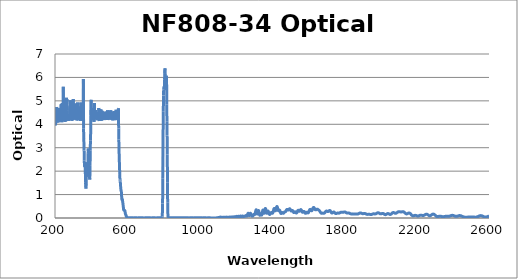
| Category | Optical Density |
|---|---|
| 2600.0 | 0.08 |
| 2599.0 | 0.078 |
| 2598.0 | 0.077 |
| 2597.0 | 0.075 |
| 2596.0 | 0.072 |
| 2595.0 | 0.069 |
| 2594.0 | 0.066 |
| 2593.0 | 0.063 |
| 2592.0 | 0.06 |
| 2591.0 | 0.057 |
| 2590.0 | 0.054 |
| 2589.0 | 0.051 |
| 2588.0 | 0.049 |
| 2587.0 | 0.046 |
| 2586.0 | 0.044 |
| 2585.0 | 0.043 |
| 2584.0 | 0.041 |
| 2583.0 | 0.04 |
| 2582.0 | 0.039 |
| 2581.0 | 0.039 |
| 2580.0 | 0.039 |
| 2579.0 | 0.039 |
| 2578.0 | 0.04 |
| 2577.0 | 0.041 |
| 2576.0 | 0.042 |
| 2575.0 | 0.044 |
| 2574.0 | 0.046 |
| 2573.0 | 0.049 |
| 2572.0 | 0.052 |
| 2571.0 | 0.055 |
| 2570.0 | 0.059 |
| 2569.0 | 0.063 |
| 2568.0 | 0.067 |
| 2567.0 | 0.072 |
| 2566.0 | 0.076 |
| 2565.0 | 0.08 |
| 2564.0 | 0.084 |
| 2563.0 | 0.087 |
| 2562.0 | 0.091 |
| 2561.0 | 0.093 |
| 2560.0 | 0.096 |
| 2559.0 | 0.098 |
| 2558.0 | 0.099 |
| 2557.0 | 0.101 |
| 2556.0 | 0.101 |
| 2555.0 | 0.102 |
| 2554.0 | 0.102 |
| 2553.0 | 0.102 |
| 2552.0 | 0.101 |
| 2551.0 | 0.1 |
| 2550.0 | 0.098 |
| 2549.0 | 0.095 |
| 2548.0 | 0.093 |
| 2547.0 | 0.09 |
| 2546.0 | 0.086 |
| 2545.0 | 0.083 |
| 2544.0 | 0.08 |
| 2543.0 | 0.076 |
| 2542.0 | 0.073 |
| 2541.0 | 0.069 |
| 2540.0 | 0.066 |
| 2539.0 | 0.063 |
| 2538.0 | 0.059 |
| 2537.0 | 0.056 |
| 2536.0 | 0.052 |
| 2535.0 | 0.049 |
| 2534.0 | 0.046 |
| 2533.0 | 0.044 |
| 2532.0 | 0.042 |
| 2531.0 | 0.039 |
| 2530.0 | 0.038 |
| 2529.0 | 0.037 |
| 2528.0 | 0.036 |
| 2527.0 | 0.035 |
| 2526.0 | 0.035 |
| 2525.0 | 0.035 |
| 2524.0 | 0.035 |
| 2523.0 | 0.035 |
| 2522.0 | 0.036 |
| 2521.0 | 0.037 |
| 2520.0 | 0.038 |
| 2519.0 | 0.039 |
| 2518.0 | 0.04 |
| 2517.0 | 0.041 |
| 2516.0 | 0.042 |
| 2515.0 | 0.043 |
| 2514.0 | 0.044 |
| 2513.0 | 0.045 |
| 2512.0 | 0.046 |
| 2511.0 | 0.046 |
| 2510.0 | 0.046 |
| 2509.0 | 0.047 |
| 2508.0 | 0.047 |
| 2507.0 | 0.047 |
| 2506.0 | 0.047 |
| 2505.0 | 0.046 |
| 2504.0 | 0.046 |
| 2503.0 | 0.045 |
| 2502.0 | 0.045 |
| 2501.0 | 0.044 |
| 2500.0 | 0.044 |
| 2499.0 | 0.043 |
| 2498.0 | 0.042 |
| 2497.0 | 0.041 |
| 2496.0 | 0.041 |
| 2495.0 | 0.04 |
| 2494.0 | 0.04 |
| 2493.0 | 0.039 |
| 2492.0 | 0.039 |
| 2491.0 | 0.039 |
| 2490.0 | 0.038 |
| 2489.0 | 0.038 |
| 2488.0 | 0.038 |
| 2487.0 | 0.038 |
| 2486.0 | 0.038 |
| 2485.0 | 0.038 |
| 2484.0 | 0.038 |
| 2483.0 | 0.037 |
| 2482.0 | 0.037 |
| 2481.0 | 0.037 |
| 2480.0 | 0.037 |
| 2479.0 | 0.037 |
| 2478.0 | 0.037 |
| 2477.0 | 0.037 |
| 2476.0 | 0.037 |
| 2475.0 | 0.037 |
| 2474.0 | 0.036 |
| 2473.0 | 0.036 |
| 2472.0 | 0.036 |
| 2471.0 | 0.036 |
| 2470.0 | 0.036 |
| 2469.0 | 0.036 |
| 2468.0 | 0.036 |
| 2467.0 | 0.037 |
| 2466.0 | 0.037 |
| 2465.0 | 0.038 |
| 2464.0 | 0.039 |
| 2463.0 | 0.04 |
| 2462.0 | 0.042 |
| 2461.0 | 0.044 |
| 2460.0 | 0.046 |
| 2459.0 | 0.048 |
| 2458.0 | 0.051 |
| 2457.0 | 0.053 |
| 2456.0 | 0.056 |
| 2455.0 | 0.06 |
| 2454.0 | 0.063 |
| 2453.0 | 0.067 |
| 2452.0 | 0.07 |
| 2451.0 | 0.074 |
| 2450.0 | 0.077 |
| 2449.0 | 0.081 |
| 2448.0 | 0.084 |
| 2447.0 | 0.087 |
| 2446.0 | 0.09 |
| 2445.0 | 0.093 |
| 2444.0 | 0.096 |
| 2443.0 | 0.098 |
| 2442.0 | 0.1 |
| 2441.0 | 0.101 |
| 2440.0 | 0.102 |
| 2439.0 | 0.103 |
| 2438.0 | 0.103 |
| 2437.0 | 0.103 |
| 2436.0 | 0.102 |
| 2435.0 | 0.101 |
| 2434.0 | 0.1 |
| 2433.0 | 0.098 |
| 2432.0 | 0.096 |
| 2431.0 | 0.094 |
| 2430.0 | 0.091 |
| 2429.0 | 0.089 |
| 2428.0 | 0.086 |
| 2427.0 | 0.083 |
| 2426.0 | 0.081 |
| 2425.0 | 0.078 |
| 2424.0 | 0.076 |
| 2423.0 | 0.074 |
| 2422.0 | 0.073 |
| 2421.0 | 0.072 |
| 2420.0 | 0.071 |
| 2419.0 | 0.071 |
| 2418.0 | 0.071 |
| 2417.0 | 0.071 |
| 2416.0 | 0.072 |
| 2415.0 | 0.073 |
| 2414.0 | 0.075 |
| 2413.0 | 0.077 |
| 2412.0 | 0.08 |
| 2411.0 | 0.083 |
| 2410.0 | 0.086 |
| 2409.0 | 0.088 |
| 2408.0 | 0.092 |
| 2407.0 | 0.095 |
| 2406.0 | 0.098 |
| 2405.0 | 0.101 |
| 2404.0 | 0.103 |
| 2403.0 | 0.106 |
| 2402.0 | 0.108 |
| 2401.0 | 0.11 |
| 2400.0 | 0.111 |
| 2399.0 | 0.112 |
| 2398.0 | 0.113 |
| 2397.0 | 0.113 |
| 2396.0 | 0.113 |
| 2395.0 | 0.112 |
| 2394.0 | 0.111 |
| 2393.0 | 0.109 |
| 2392.0 | 0.108 |
| 2391.0 | 0.105 |
| 2390.0 | 0.103 |
| 2389.0 | 0.1 |
| 2388.0 | 0.097 |
| 2387.0 | 0.094 |
| 2386.0 | 0.091 |
| 2385.0 | 0.089 |
| 2384.0 | 0.086 |
| 2383.0 | 0.083 |
| 2382.0 | 0.081 |
| 2381.0 | 0.079 |
| 2380.0 | 0.077 |
| 2379.0 | 0.076 |
| 2378.0 | 0.075 |
| 2377.0 | 0.074 |
| 2376.0 | 0.073 |
| 2375.0 | 0.073 |
| 2374.0 | 0.073 |
| 2373.0 | 0.073 |
| 2372.0 | 0.073 |
| 2371.0 | 0.073 |
| 2370.0 | 0.074 |
| 2369.0 | 0.074 |
| 2368.0 | 0.075 |
| 2367.0 | 0.075 |
| 2366.0 | 0.075 |
| 2365.0 | 0.075 |
| 2364.0 | 0.075 |
| 2363.0 | 0.075 |
| 2362.0 | 0.074 |
| 2361.0 | 0.074 |
| 2360.0 | 0.073 |
| 2359.0 | 0.071 |
| 2358.0 | 0.07 |
| 2357.0 | 0.068 |
| 2356.0 | 0.067 |
| 2355.0 | 0.065 |
| 2354.0 | 0.063 |
| 2353.0 | 0.061 |
| 2352.0 | 0.06 |
| 2351.0 | 0.058 |
| 2350.0 | 0.057 |
| 2349.0 | 0.056 |
| 2348.0 | 0.055 |
| 2347.0 | 0.055 |
| 2346.0 | 0.054 |
| 2345.0 | 0.055 |
| 2344.0 | 0.055 |
| 2343.0 | 0.056 |
| 2342.0 | 0.058 |
| 2341.0 | 0.059 |
| 2340.0 | 0.061 |
| 2339.0 | 0.063 |
| 2338.0 | 0.065 |
| 2337.0 | 0.067 |
| 2336.0 | 0.069 |
| 2335.0 | 0.071 |
| 2334.0 | 0.073 |
| 2333.0 | 0.075 |
| 2332.0 | 0.076 |
| 2331.0 | 0.077 |
| 2330.0 | 0.078 |
| 2329.0 | 0.078 |
| 2328.0 | 0.078 |
| 2327.0 | 0.078 |
| 2326.0 | 0.077 |
| 2325.0 | 0.076 |
| 2324.0 | 0.074 |
| 2323.0 | 0.073 |
| 2322.0 | 0.071 |
| 2321.0 | 0.069 |
| 2320.0 | 0.067 |
| 2319.0 | 0.065 |
| 2318.0 | 0.064 |
| 2317.0 | 0.062 |
| 2316.0 | 0.062 |
| 2315.0 | 0.061 |
| 2314.0 | 0.062 |
| 2313.0 | 0.063 |
| 2312.0 | 0.065 |
| 2311.0 | 0.068 |
| 2310.0 | 0.071 |
| 2309.0 | 0.075 |
| 2308.0 | 0.08 |
| 2307.0 | 0.086 |
| 2306.0 | 0.092 |
| 2305.0 | 0.098 |
| 2304.0 | 0.105 |
| 2303.0 | 0.113 |
| 2302.0 | 0.12 |
| 2301.0 | 0.127 |
| 2300.0 | 0.133 |
| 2299.0 | 0.14 |
| 2298.0 | 0.146 |
| 2297.0 | 0.151 |
| 2296.0 | 0.156 |
| 2295.0 | 0.16 |
| 2294.0 | 0.162 |
| 2293.0 | 0.165 |
| 2292.0 | 0.166 |
| 2291.0 | 0.166 |
| 2290.0 | 0.166 |
| 2289.0 | 0.164 |
| 2288.0 | 0.162 |
| 2287.0 | 0.159 |
| 2286.0 | 0.155 |
| 2285.0 | 0.15 |
| 2284.0 | 0.145 |
| 2283.0 | 0.139 |
| 2282.0 | 0.134 |
| 2281.0 | 0.128 |
| 2280.0 | 0.122 |
| 2279.0 | 0.116 |
| 2278.0 | 0.111 |
| 2277.0 | 0.106 |
| 2276.0 | 0.102 |
| 2275.0 | 0.099 |
| 2274.0 | 0.097 |
| 2273.0 | 0.096 |
| 2272.0 | 0.096 |
| 2271.0 | 0.097 |
| 2270.0 | 0.099 |
| 2269.0 | 0.102 |
| 2268.0 | 0.106 |
| 2267.0 | 0.111 |
| 2266.0 | 0.116 |
| 2265.0 | 0.121 |
| 2264.0 | 0.126 |
| 2263.0 | 0.132 |
| 2262.0 | 0.137 |
| 2261.0 | 0.142 |
| 2260.0 | 0.147 |
| 2259.0 | 0.151 |
| 2258.0 | 0.155 |
| 2257.0 | 0.157 |
| 2256.0 | 0.159 |
| 2255.0 | 0.16 |
| 2254.0 | 0.161 |
| 2253.0 | 0.16 |
| 2252.0 | 0.159 |
| 2251.0 | 0.157 |
| 2250.0 | 0.154 |
| 2249.0 | 0.151 |
| 2248.0 | 0.147 |
| 2247.0 | 0.142 |
| 2246.0 | 0.138 |
| 2245.0 | 0.134 |
| 2244.0 | 0.129 |
| 2243.0 | 0.125 |
| 2242.0 | 0.12 |
| 2241.0 | 0.116 |
| 2240.0 | 0.113 |
| 2239.0 | 0.11 |
| 2238.0 | 0.108 |
| 2237.0 | 0.106 |
| 2236.0 | 0.106 |
| 2235.0 | 0.105 |
| 2234.0 | 0.106 |
| 2233.0 | 0.107 |
| 2232.0 | 0.108 |
| 2231.0 | 0.11 |
| 2230.0 | 0.112 |
| 2229.0 | 0.114 |
| 2228.0 | 0.116 |
| 2227.0 | 0.117 |
| 2226.0 | 0.119 |
| 2225.0 | 0.12 |
| 2224.0 | 0.12 |
| 2223.0 | 0.121 |
| 2222.0 | 0.12 |
| 2221.0 | 0.119 |
| 2220.0 | 0.118 |
| 2219.0 | 0.115 |
| 2218.0 | 0.113 |
| 2217.0 | 0.111 |
| 2216.0 | 0.107 |
| 2215.0 | 0.105 |
| 2214.0 | 0.102 |
| 2213.0 | 0.098 |
| 2212.0 | 0.096 |
| 2211.0 | 0.093 |
| 2210.0 | 0.09 |
| 2209.0 | 0.089 |
| 2208.0 | 0.087 |
| 2207.0 | 0.087 |
| 2206.0 | 0.087 |
| 2205.0 | 0.087 |
| 2204.0 | 0.088 |
| 2203.0 | 0.09 |
| 2202.0 | 0.092 |
| 2201.0 | 0.094 |
| 2200.0 | 0.097 |
| 2199.0 | 0.1 |
| 2198.0 | 0.103 |
| 2197.0 | 0.105 |
| 2196.0 | 0.108 |
| 2195.0 | 0.11 |
| 2194.0 | 0.111 |
| 2193.0 | 0.112 |
| 2192.0 | 0.113 |
| 2191.0 | 0.113 |
| 2190.0 | 0.112 |
| 2189.0 | 0.111 |
| 2188.0 | 0.109 |
| 2187.0 | 0.107 |
| 2186.0 | 0.104 |
| 2185.0 | 0.102 |
| 2184.0 | 0.099 |
| 2183.0 | 0.097 |
| 2182.0 | 0.095 |
| 2181.0 | 0.095 |
| 2180.0 | 0.094 |
| 2179.0 | 0.095 |
| 2178.0 | 0.097 |
| 2177.0 | 0.099 |
| 2176.0 | 0.103 |
| 2175.0 | 0.108 |
| 2174.0 | 0.113 |
| 2173.0 | 0.12 |
| 2172.0 | 0.127 |
| 2171.0 | 0.135 |
| 2170.0 | 0.144 |
| 2169.0 | 0.152 |
| 2168.0 | 0.161 |
| 2167.0 | 0.169 |
| 2166.0 | 0.177 |
| 2165.0 | 0.185 |
| 2164.0 | 0.192 |
| 2163.0 | 0.198 |
| 2162.0 | 0.203 |
| 2161.0 | 0.207 |
| 2160.0 | 0.21 |
| 2159.0 | 0.212 |
| 2158.0 | 0.213 |
| 2157.0 | 0.212 |
| 2156.0 | 0.211 |
| 2155.0 | 0.209 |
| 2154.0 | 0.206 |
| 2153.0 | 0.202 |
| 2152.0 | 0.198 |
| 2151.0 | 0.193 |
| 2150.0 | 0.189 |
| 2149.0 | 0.185 |
| 2148.0 | 0.181 |
| 2147.0 | 0.178 |
| 2146.0 | 0.176 |
| 2145.0 | 0.175 |
| 2144.0 | 0.175 |
| 2143.0 | 0.177 |
| 2142.0 | 0.179 |
| 2141.0 | 0.183 |
| 2140.0 | 0.187 |
| 2139.0 | 0.193 |
| 2138.0 | 0.199 |
| 2137.0 | 0.206 |
| 2136.0 | 0.213 |
| 2135.0 | 0.22 |
| 2134.0 | 0.228 |
| 2133.0 | 0.234 |
| 2132.0 | 0.241 |
| 2131.0 | 0.247 |
| 2130.0 | 0.252 |
| 2129.0 | 0.257 |
| 2128.0 | 0.261 |
| 2127.0 | 0.264 |
| 2126.0 | 0.266 |
| 2125.0 | 0.268 |
| 2124.0 | 0.268 |
| 2123.0 | 0.269 |
| 2122.0 | 0.268 |
| 2121.0 | 0.267 |
| 2120.0 | 0.266 |
| 2119.0 | 0.265 |
| 2118.0 | 0.263 |
| 2117.0 | 0.262 |
| 2116.0 | 0.261 |
| 2115.0 | 0.26 |
| 2114.0 | 0.259 |
| 2113.0 | 0.259 |
| 2112.0 | 0.259 |
| 2111.0 | 0.26 |
| 2110.0 | 0.262 |
| 2109.0 | 0.263 |
| 2108.0 | 0.265 |
| 2107.0 | 0.267 |
| 2106.0 | 0.268 |
| 2105.0 | 0.27 |
| 2104.0 | 0.271 |
| 2103.0 | 0.272 |
| 2102.0 | 0.272 |
| 2101.0 | 0.271 |
| 2100.0 | 0.27 |
| 2099.0 | 0.267 |
| 2098.0 | 0.264 |
| 2097.0 | 0.261 |
| 2096.0 | 0.256 |
| 2095.0 | 0.252 |
| 2094.0 | 0.246 |
| 2093.0 | 0.241 |
| 2092.0 | 0.235 |
| 2091.0 | 0.228 |
| 2090.0 | 0.223 |
| 2089.0 | 0.217 |
| 2088.0 | 0.212 |
| 2087.0 | 0.208 |
| 2086.0 | 0.205 |
| 2085.0 | 0.202 |
| 2084.0 | 0.201 |
| 2083.0 | 0.201 |
| 2082.0 | 0.202 |
| 2081.0 | 0.203 |
| 2080.0 | 0.206 |
| 2079.0 | 0.209 |
| 2078.0 | 0.213 |
| 2077.0 | 0.217 |
| 2076.0 | 0.221 |
| 2075.0 | 0.224 |
| 2074.0 | 0.227 |
| 2073.0 | 0.23 |
| 2072.0 | 0.232 |
| 2071.0 | 0.232 |
| 2070.0 | 0.232 |
| 2069.0 | 0.23 |
| 2068.0 | 0.227 |
| 2067.0 | 0.223 |
| 2066.0 | 0.218 |
| 2065.0 | 0.212 |
| 2064.0 | 0.205 |
| 2063.0 | 0.198 |
| 2062.0 | 0.191 |
| 2061.0 | 0.184 |
| 2060.0 | 0.176 |
| 2059.0 | 0.17 |
| 2058.0 | 0.164 |
| 2057.0 | 0.159 |
| 2056.0 | 0.155 |
| 2055.0 | 0.153 |
| 2054.0 | 0.152 |
| 2053.0 | 0.152 |
| 2052.0 | 0.153 |
| 2051.0 | 0.156 |
| 2050.0 | 0.159 |
| 2049.0 | 0.163 |
| 2048.0 | 0.167 |
| 2047.0 | 0.171 |
| 2046.0 | 0.176 |
| 2045.0 | 0.18 |
| 2044.0 | 0.183 |
| 2043.0 | 0.186 |
| 2042.0 | 0.188 |
| 2041.0 | 0.189 |
| 2040.0 | 0.188 |
| 2039.0 | 0.187 |
| 2038.0 | 0.185 |
| 2037.0 | 0.181 |
| 2036.0 | 0.177 |
| 2035.0 | 0.172 |
| 2034.0 | 0.167 |
| 2033.0 | 0.162 |
| 2032.0 | 0.157 |
| 2031.0 | 0.152 |
| 2030.0 | 0.148 |
| 2029.0 | 0.145 |
| 2028.0 | 0.143 |
| 2027.0 | 0.143 |
| 2026.0 | 0.143 |
| 2025.0 | 0.145 |
| 2024.0 | 0.148 |
| 2023.0 | 0.152 |
| 2022.0 | 0.157 |
| 2021.0 | 0.162 |
| 2020.0 | 0.167 |
| 2019.0 | 0.172 |
| 2018.0 | 0.178 |
| 2017.0 | 0.183 |
| 2016.0 | 0.186 |
| 2015.0 | 0.19 |
| 2014.0 | 0.192 |
| 2013.0 | 0.194 |
| 2012.0 | 0.194 |
| 2011.0 | 0.194 |
| 2010.0 | 0.193 |
| 2009.0 | 0.192 |
| 2008.0 | 0.19 |
| 2007.0 | 0.187 |
| 2006.0 | 0.185 |
| 2005.0 | 0.182 |
| 2004.0 | 0.18 |
| 2003.0 | 0.178 |
| 2002.0 | 0.177 |
| 2001.0 | 0.176 |
| 2000.0 | 0.177 |
| 1999.0 | 0.179 |
| 1998.0 | 0.181 |
| 1997.0 | 0.185 |
| 1996.0 | 0.189 |
| 1995.0 | 0.193 |
| 1994.0 | 0.198 |
| 1993.0 | 0.204 |
| 1992.0 | 0.209 |
| 1991.0 | 0.213 |
| 1990.0 | 0.217 |
| 1989.0 | 0.22 |
| 1988.0 | 0.222 |
| 1987.0 | 0.224 |
| 1986.0 | 0.224 |
| 1985.0 | 0.223 |
| 1984.0 | 0.221 |
| 1983.0 | 0.218 |
| 1982.0 | 0.215 |
| 1981.0 | 0.211 |
| 1980.0 | 0.206 |
| 1979.0 | 0.201 |
| 1978.0 | 0.196 |
| 1977.0 | 0.191 |
| 1976.0 | 0.187 |
| 1975.0 | 0.183 |
| 1974.0 | 0.18 |
| 1973.0 | 0.177 |
| 1972.0 | 0.175 |
| 1971.0 | 0.174 |
| 1970.0 | 0.174 |
| 1969.0 | 0.174 |
| 1968.0 | 0.174 |
| 1967.0 | 0.175 |
| 1966.0 | 0.176 |
| 1965.0 | 0.177 |
| 1964.0 | 0.178 |
| 1963.0 | 0.178 |
| 1962.0 | 0.178 |
| 1961.0 | 0.178 |
| 1960.0 | 0.177 |
| 1959.0 | 0.175 |
| 1958.0 | 0.173 |
| 1957.0 | 0.17 |
| 1956.0 | 0.167 |
| 1955.0 | 0.164 |
| 1954.0 | 0.161 |
| 1953.0 | 0.158 |
| 1952.0 | 0.155 |
| 1951.0 | 0.152 |
| 1950.0 | 0.15 |
| 1949.0 | 0.149 |
| 1948.0 | 0.148 |
| 1947.0 | 0.148 |
| 1946.0 | 0.148 |
| 1945.0 | 0.149 |
| 1944.0 | 0.151 |
| 1943.0 | 0.152 |
| 1942.0 | 0.154 |
| 1941.0 | 0.155 |
| 1940.0 | 0.157 |
| 1939.0 | 0.158 |
| 1938.0 | 0.159 |
| 1937.0 | 0.16 |
| 1936.0 | 0.16 |
| 1935.0 | 0.159 |
| 1934.0 | 0.158 |
| 1933.0 | 0.158 |
| 1932.0 | 0.157 |
| 1931.0 | 0.155 |
| 1930.0 | 0.155 |
| 1929.0 | 0.154 |
| 1928.0 | 0.154 |
| 1927.0 | 0.154 |
| 1926.0 | 0.155 |
| 1925.0 | 0.157 |
| 1924.0 | 0.159 |
| 1923.0 | 0.161 |
| 1922.0 | 0.165 |
| 1921.0 | 0.169 |
| 1920.0 | 0.173 |
| 1919.0 | 0.178 |
| 1918.0 | 0.182 |
| 1917.0 | 0.184 |
| 1916.0 | 0.187 |
| 1915.0 | 0.189 |
| 1914.0 | 0.191 |
| 1913.0 | 0.193 |
| 1912.0 | 0.194 |
| 1911.0 | 0.194 |
| 1910.0 | 0.193 |
| 1909.0 | 0.191 |
| 1908.0 | 0.19 |
| 1907.0 | 0.188 |
| 1906.0 | 0.187 |
| 1905.0 | 0.186 |
| 1904.0 | 0.185 |
| 1903.0 | 0.185 |
| 1902.0 | 0.184 |
| 1901.0 | 0.185 |
| 1900.0 | 0.187 |
| 1899.0 | 0.19 |
| 1898.0 | 0.193 |
| 1897.0 | 0.196 |
| 1896.0 | 0.199 |
| 1895.0 | 0.202 |
| 1894.0 | 0.205 |
| 1893.0 | 0.208 |
| 1892.0 | 0.212 |
| 1891.0 | 0.215 |
| 1890.0 | 0.217 |
| 1889.0 | 0.218 |
| 1888.0 | 0.217 |
| 1887.0 | 0.216 |
| 1886.0 | 0.214 |
| 1885.0 | 0.211 |
| 1884.0 | 0.208 |
| 1883.0 | 0.204 |
| 1882.0 | 0.2 |
| 1881.0 | 0.195 |
| 1880.0 | 0.19 |
| 1879.0 | 0.185 |
| 1878.0 | 0.181 |
| 1877.0 | 0.177 |
| 1876.0 | 0.174 |
| 1875.0 | 0.171 |
| 1874.0 | 0.169 |
| 1873.0 | 0.168 |
| 1872.0 | 0.167 |
| 1871.0 | 0.166 |
| 1870.0 | 0.166 |
| 1869.0 | 0.166 |
| 1868.0 | 0.166 |
| 1867.0 | 0.167 |
| 1866.0 | 0.166 |
| 1865.0 | 0.166 |
| 1864.0 | 0.166 |
| 1863.0 | 0.166 |
| 1862.0 | 0.165 |
| 1861.0 | 0.166 |
| 1860.0 | 0.166 |
| 1859.0 | 0.167 |
| 1858.0 | 0.167 |
| 1857.0 | 0.167 |
| 1856.0 | 0.168 |
| 1855.0 | 0.168 |
| 1854.0 | 0.169 |
| 1853.0 | 0.171 |
| 1852.0 | 0.172 |
| 1851.0 | 0.173 |
| 1850.0 | 0.173 |
| 1849.0 | 0.174 |
| 1848.0 | 0.174 |
| 1847.0 | 0.176 |
| 1846.0 | 0.176 |
| 1845.0 | 0.176 |
| 1844.0 | 0.175 |
| 1843.0 | 0.173 |
| 1842.0 | 0.172 |
| 1841.0 | 0.172 |
| 1840.0 | 0.173 |
| 1839.0 | 0.173 |
| 1838.0 | 0.173 |
| 1837.0 | 0.175 |
| 1836.0 | 0.177 |
| 1835.0 | 0.179 |
| 1834.0 | 0.182 |
| 1833.0 | 0.185 |
| 1832.0 | 0.188 |
| 1831.0 | 0.193 |
| 1830.0 | 0.198 |
| 1829.0 | 0.202 |
| 1828.0 | 0.205 |
| 1827.0 | 0.209 |
| 1826.0 | 0.211 |
| 1825.0 | 0.213 |
| 1824.0 | 0.214 |
| 1823.0 | 0.213 |
| 1822.0 | 0.213 |
| 1821.0 | 0.213 |
| 1820.0 | 0.213 |
| 1819.0 | 0.212 |
| 1818.0 | 0.212 |
| 1817.0 | 0.211 |
| 1816.0 | 0.211 |
| 1815.0 | 0.212 |
| 1814.0 | 0.214 |
| 1813.0 | 0.216 |
| 1812.0 | 0.22 |
| 1811.0 | 0.225 |
| 1810.0 | 0.23 |
| 1809.0 | 0.234 |
| 1808.0 | 0.239 |
| 1807.0 | 0.244 |
| 1806.0 | 0.249 |
| 1805.0 | 0.253 |
| 1804.0 | 0.256 |
| 1803.0 | 0.259 |
| 1802.0 | 0.26 |
| 1801.0 | 0.26 |
| 1800.0 | 0.259 |
| 1799.0 | 0.257 |
| 1798.0 | 0.255 |
| 1797.0 | 0.252 |
| 1796.0 | 0.249 |
| 1795.0 | 0.246 |
| 1794.0 | 0.244 |
| 1793.0 | 0.242 |
| 1792.0 | 0.241 |
| 1791.0 | 0.241 |
| 1790.0 | 0.241 |
| 1789.0 | 0.242 |
| 1788.0 | 0.244 |
| 1787.0 | 0.245 |
| 1786.0 | 0.247 |
| 1785.0 | 0.248 |
| 1784.0 | 0.249 |
| 1783.0 | 0.249 |
| 1782.0 | 0.248 |
| 1781.0 | 0.246 |
| 1780.0 | 0.243 |
| 1779.0 | 0.239 |
| 1778.0 | 0.235 |
| 1777.0 | 0.23 |
| 1776.0 | 0.225 |
| 1775.0 | 0.22 |
| 1774.0 | 0.216 |
| 1773.0 | 0.212 |
| 1772.0 | 0.209 |
| 1771.0 | 0.208 |
| 1770.0 | 0.207 |
| 1769.0 | 0.207 |
| 1768.0 | 0.208 |
| 1767.0 | 0.209 |
| 1766.0 | 0.211 |
| 1765.0 | 0.212 |
| 1764.0 | 0.213 |
| 1763.0 | 0.213 |
| 1762.0 | 0.212 |
| 1761.0 | 0.21 |
| 1760.0 | 0.207 |
| 1759.0 | 0.203 |
| 1758.0 | 0.199 |
| 1757.0 | 0.195 |
| 1756.0 | 0.191 |
| 1755.0 | 0.188 |
| 1754.0 | 0.187 |
| 1753.0 | 0.187 |
| 1752.0 | 0.189 |
| 1751.0 | 0.193 |
| 1750.0 | 0.199 |
| 1749.0 | 0.207 |
| 1748.0 | 0.215 |
| 1747.0 | 0.224 |
| 1746.0 | 0.233 |
| 1745.0 | 0.241 |
| 1744.0 | 0.247 |
| 1743.0 | 0.252 |
| 1742.0 | 0.255 |
| 1741.0 | 0.255 |
| 1740.0 | 0.253 |
| 1739.0 | 0.249 |
| 1738.0 | 0.244 |
| 1737.0 | 0.237 |
| 1736.0 | 0.23 |
| 1735.0 | 0.224 |
| 1734.0 | 0.218 |
| 1733.0 | 0.215 |
| 1732.0 | 0.213 |
| 1731.0 | 0.215 |
| 1730.0 | 0.219 |
| 1729.0 | 0.226 |
| 1728.0 | 0.236 |
| 1727.0 | 0.248 |
| 1726.0 | 0.261 |
| 1725.0 | 0.274 |
| 1724.0 | 0.286 |
| 1723.0 | 0.297 |
| 1722.0 | 0.307 |
| 1721.0 | 0.315 |
| 1720.0 | 0.319 |
| 1719.0 | 0.321 |
| 1718.0 | 0.32 |
| 1717.0 | 0.317 |
| 1716.0 | 0.312 |
| 1715.0 | 0.305 |
| 1714.0 | 0.297 |
| 1713.0 | 0.29 |
| 1712.0 | 0.283 |
| 1711.0 | 0.278 |
| 1710.0 | 0.275 |
| 1709.0 | 0.274 |
| 1708.0 | 0.274 |
| 1707.0 | 0.277 |
| 1706.0 | 0.281 |
| 1705.0 | 0.285 |
| 1704.0 | 0.29 |
| 1703.0 | 0.293 |
| 1702.0 | 0.295 |
| 1701.0 | 0.296 |
| 1700.0 | 0.294 |
| 1699.0 | 0.291 |
| 1698.0 | 0.284 |
| 1697.0 | 0.277 |
| 1696.0 | 0.268 |
| 1695.0 | 0.258 |
| 1694.0 | 0.248 |
| 1693.0 | 0.237 |
| 1692.0 | 0.228 |
| 1691.0 | 0.219 |
| 1690.0 | 0.213 |
| 1689.0 | 0.208 |
| 1688.0 | 0.205 |
| 1687.0 | 0.204 |
| 1686.0 | 0.204 |
| 1685.0 | 0.205 |
| 1684.0 | 0.206 |
| 1683.0 | 0.207 |
| 1682.0 | 0.208 |
| 1681.0 | 0.208 |
| 1680.0 | 0.208 |
| 1679.0 | 0.206 |
| 1678.0 | 0.204 |
| 1677.0 | 0.202 |
| 1676.0 | 0.201 |
| 1675.0 | 0.2 |
| 1674.0 | 0.201 |
| 1673.0 | 0.204 |
| 1672.0 | 0.209 |
| 1671.0 | 0.216 |
| 1670.0 | 0.225 |
| 1669.0 | 0.235 |
| 1668.0 | 0.246 |
| 1667.0 | 0.257 |
| 1666.0 | 0.269 |
| 1665.0 | 0.28 |
| 1664.0 | 0.291 |
| 1663.0 | 0.301 |
| 1662.0 | 0.31 |
| 1661.0 | 0.318 |
| 1660.0 | 0.325 |
| 1659.0 | 0.333 |
| 1658.0 | 0.34 |
| 1657.0 | 0.347 |
| 1656.0 | 0.353 |
| 1655.0 | 0.359 |
| 1654.0 | 0.364 |
| 1653.0 | 0.369 |
| 1652.0 | 0.373 |
| 1651.0 | 0.375 |
| 1650.0 | 0.376 |
| 1649.0 | 0.376 |
| 1648.0 | 0.374 |
| 1647.0 | 0.37 |
| 1646.0 | 0.365 |
| 1645.0 | 0.36 |
| 1644.0 | 0.354 |
| 1643.0 | 0.35 |
| 1642.0 | 0.347 |
| 1641.0 | 0.347 |
| 1640.0 | 0.35 |
| 1639.0 | 0.356 |
| 1638.0 | 0.366 |
| 1637.0 | 0.378 |
| 1636.0 | 0.392 |
| 1635.0 | 0.407 |
| 1634.0 | 0.421 |
| 1633.0 | 0.434 |
| 1632.0 | 0.444 |
| 1631.0 | 0.45 |
| 1630.0 | 0.452 |
| 1629.0 | 0.449 |
| 1628.0 | 0.442 |
| 1627.0 | 0.43 |
| 1626.0 | 0.414 |
| 1625.0 | 0.395 |
| 1624.0 | 0.375 |
| 1623.0 | 0.355 |
| 1622.0 | 0.337 |
| 1621.0 | 0.323 |
| 1620.0 | 0.314 |
| 1619.0 | 0.31 |
| 1618.0 | 0.311 |
| 1617.0 | 0.317 |
| 1616.0 | 0.327 |
| 1615.0 | 0.338 |
| 1614.0 | 0.349 |
| 1613.0 | 0.359 |
| 1612.0 | 0.366 |
| 1611.0 | 0.369 |
| 1610.0 | 0.367 |
| 1609.0 | 0.36 |
| 1608.0 | 0.348 |
| 1607.0 | 0.332 |
| 1606.0 | 0.313 |
| 1605.0 | 0.292 |
| 1604.0 | 0.271 |
| 1603.0 | 0.251 |
| 1602.0 | 0.235 |
| 1601.0 | 0.224 |
| 1600.0 | 0.218 |
| 1599.0 | 0.218 |
| 1598.0 | 0.222 |
| 1597.0 | 0.228 |
| 1596.0 | 0.236 |
| 1595.0 | 0.242 |
| 1594.0 | 0.247 |
| 1593.0 | 0.247 |
| 1592.0 | 0.245 |
| 1591.0 | 0.238 |
| 1590.0 | 0.23 |
| 1589.0 | 0.22 |
| 1588.0 | 0.21 |
| 1587.0 | 0.203 |
| 1586.0 | 0.199 |
| 1585.0 | 0.2 |
| 1584.0 | 0.206 |
| 1583.0 | 0.216 |
| 1582.0 | 0.228 |
| 1581.0 | 0.242 |
| 1580.0 | 0.256 |
| 1579.0 | 0.267 |
| 1578.0 | 0.276 |
| 1577.0 | 0.281 |
| 1576.0 | 0.281 |
| 1575.0 | 0.277 |
| 1574.0 | 0.271 |
| 1573.0 | 0.262 |
| 1572.0 | 0.253 |
| 1571.0 | 0.246 |
| 1570.0 | 0.242 |
| 1569.0 | 0.242 |
| 1568.0 | 0.247 |
| 1567.0 | 0.258 |
| 1566.0 | 0.273 |
| 1565.0 | 0.291 |
| 1564.0 | 0.309 |
| 1563.0 | 0.327 |
| 1562.0 | 0.342 |
| 1561.0 | 0.352 |
| 1560.0 | 0.358 |
| 1559.0 | 0.358 |
| 1558.0 | 0.353 |
| 1557.0 | 0.343 |
| 1556.0 | 0.331 |
| 1555.0 | 0.318 |
| 1554.0 | 0.305 |
| 1553.0 | 0.296 |
| 1552.0 | 0.29 |
| 1551.0 | 0.29 |
| 1550.0 | 0.294 |
| 1549.0 | 0.301 |
| 1548.0 | 0.31 |
| 1547.0 | 0.319 |
| 1546.0 | 0.325 |
| 1545.0 | 0.328 |
| 1544.0 | 0.327 |
| 1543.0 | 0.32 |
| 1542.0 | 0.308 |
| 1541.0 | 0.293 |
| 1540.0 | 0.275 |
| 1539.0 | 0.256 |
| 1538.0 | 0.238 |
| 1537.0 | 0.225 |
| 1536.0 | 0.215 |
| 1535.0 | 0.212 |
| 1534.0 | 0.214 |
| 1533.0 | 0.222 |
| 1532.0 | 0.232 |
| 1531.0 | 0.243 |
| 1530.0 | 0.252 |
| 1529.0 | 0.26 |
| 1528.0 | 0.264 |
| 1527.0 | 0.264 |
| 1526.0 | 0.259 |
| 1525.0 | 0.253 |
| 1524.0 | 0.244 |
| 1523.0 | 0.237 |
| 1522.0 | 0.232 |
| 1521.0 | 0.231 |
| 1520.0 | 0.236 |
| 1519.0 | 0.245 |
| 1518.0 | 0.259 |
| 1517.0 | 0.274 |
| 1516.0 | 0.29 |
| 1515.0 | 0.304 |
| 1514.0 | 0.314 |
| 1513.0 | 0.321 |
| 1512.0 | 0.322 |
| 1511.0 | 0.319 |
| 1510.0 | 0.313 |
| 1509.0 | 0.306 |
| 1508.0 | 0.3 |
| 1507.0 | 0.297 |
| 1506.0 | 0.299 |
| 1505.0 | 0.305 |
| 1504.0 | 0.316 |
| 1503.0 | 0.33 |
| 1502.0 | 0.347 |
| 1501.0 | 0.363 |
| 1500.0 | 0.377 |
| 1499.0 | 0.387 |
| 1498.0 | 0.393 |
| 1497.0 | 0.394 |
| 1496.0 | 0.39 |
| 1495.0 | 0.383 |
| 1494.0 | 0.373 |
| 1493.0 | 0.362 |
| 1492.0 | 0.352 |
| 1491.0 | 0.344 |
| 1490.0 | 0.34 |
| 1489.0 | 0.339 |
| 1488.0 | 0.342 |
| 1487.0 | 0.348 |
| 1486.0 | 0.355 |
| 1485.0 | 0.361 |
| 1484.0 | 0.365 |
| 1483.0 | 0.365 |
| 1482.0 | 0.361 |
| 1481.0 | 0.353 |
| 1480.0 | 0.34 |
| 1479.0 | 0.325 |
| 1478.0 | 0.31 |
| 1477.0 | 0.295 |
| 1476.0 | 0.282 |
| 1475.0 | 0.273 |
| 1474.0 | 0.267 |
| 1473.0 | 0.265 |
| 1472.0 | 0.264 |
| 1471.0 | 0.263 |
| 1470.0 | 0.261 |
| 1469.0 | 0.256 |
| 1468.0 | 0.249 |
| 1467.0 | 0.238 |
| 1466.0 | 0.227 |
| 1465.0 | 0.216 |
| 1464.0 | 0.207 |
| 1463.0 | 0.203 |
| 1462.0 | 0.202 |
| 1461.0 | 0.205 |
| 1460.0 | 0.212 |
| 1459.0 | 0.22 |
| 1458.0 | 0.228 |
| 1457.0 | 0.233 |
| 1456.0 | 0.234 |
| 1455.0 | 0.23 |
| 1454.0 | 0.223 |
| 1453.0 | 0.213 |
| 1452.0 | 0.203 |
| 1451.0 | 0.195 |
| 1450.0 | 0.193 |
| 1449.0 | 0.197 |
| 1448.0 | 0.21 |
| 1447.0 | 0.23 |
| 1446.0 | 0.254 |
| 1445.0 | 0.279 |
| 1444.0 | 0.304 |
| 1443.0 | 0.322 |
| 1442.0 | 0.333 |
| 1441.0 | 0.337 |
| 1440.0 | 0.335 |
| 1439.0 | 0.326 |
| 1438.0 | 0.317 |
| 1437.0 | 0.31 |
| 1436.0 | 0.31 |
| 1435.0 | 0.318 |
| 1434.0 | 0.337 |
| 1433.0 | 0.364 |
| 1432.0 | 0.396 |
| 1431.0 | 0.428 |
| 1430.0 | 0.457 |
| 1429.0 | 0.477 |
| 1428.0 | 0.489 |
| 1427.0 | 0.489 |
| 1426.0 | 0.478 |
| 1425.0 | 0.457 |
| 1424.0 | 0.426 |
| 1423.0 | 0.391 |
| 1422.0 | 0.358 |
| 1421.0 | 0.33 |
| 1420.0 | 0.311 |
| 1419.0 | 0.306 |
| 1418.0 | 0.315 |
| 1417.0 | 0.332 |
| 1416.0 | 0.353 |
| 1415.0 | 0.375 |
| 1414.0 | 0.394 |
| 1413.0 | 0.405 |
| 1412.0 | 0.406 |
| 1411.0 | 0.396 |
| 1410.0 | 0.375 |
| 1409.0 | 0.347 |
| 1408.0 | 0.315 |
| 1407.0 | 0.281 |
| 1406.0 | 0.252 |
| 1405.0 | 0.228 |
| 1404.0 | 0.211 |
| 1403.0 | 0.205 |
| 1402.0 | 0.207 |
| 1401.0 | 0.216 |
| 1400.0 | 0.227 |
| 1399.0 | 0.236 |
| 1398.0 | 0.241 |
| 1397.0 | 0.239 |
| 1396.0 | 0.233 |
| 1395.0 | 0.224 |
| 1394.0 | 0.214 |
| 1393.0 | 0.202 |
| 1392.0 | 0.187 |
| 1391.0 | 0.175 |
| 1390.0 | 0.165 |
| 1389.0 | 0.156 |
| 1388.0 | 0.15 |
| 1387.0 | 0.15 |
| 1386.0 | 0.154 |
| 1385.0 | 0.164 |
| 1384.0 | 0.18 |
| 1383.0 | 0.203 |
| 1382.0 | 0.23 |
| 1381.0 | 0.256 |
| 1380.0 | 0.277 |
| 1379.0 | 0.291 |
| 1378.0 | 0.298 |
| 1377.0 | 0.295 |
| 1376.0 | 0.285 |
| 1375.0 | 0.267 |
| 1374.0 | 0.245 |
| 1373.0 | 0.223 |
| 1372.0 | 0.207 |
| 1371.0 | 0.203 |
| 1370.0 | 0.215 |
| 1369.0 | 0.24 |
| 1368.0 | 0.277 |
| 1367.0 | 0.32 |
| 1366.0 | 0.356 |
| 1365.0 | 0.385 |
| 1364.0 | 0.403 |
| 1363.0 | 0.405 |
| 1362.0 | 0.389 |
| 1361.0 | 0.358 |
| 1360.0 | 0.319 |
| 1359.0 | 0.274 |
| 1358.0 | 0.234 |
| 1357.0 | 0.206 |
| 1356.0 | 0.199 |
| 1355.0 | 0.214 |
| 1354.0 | 0.245 |
| 1353.0 | 0.281 |
| 1352.0 | 0.313 |
| 1351.0 | 0.334 |
| 1350.0 | 0.339 |
| 1349.0 | 0.327 |
| 1348.0 | 0.3 |
| 1347.0 | 0.26 |
| 1346.0 | 0.215 |
| 1345.0 | 0.171 |
| 1344.0 | 0.139 |
| 1343.0 | 0.125 |
| 1342.0 | 0.127 |
| 1341.0 | 0.141 |
| 1340.0 | 0.16 |
| 1339.0 | 0.176 |
| 1338.0 | 0.183 |
| 1337.0 | 0.178 |
| 1336.0 | 0.163 |
| 1335.0 | 0.143 |
| 1334.0 | 0.123 |
| 1333.0 | 0.113 |
| 1332.0 | 0.119 |
| 1331.0 | 0.142 |
| 1330.0 | 0.18 |
| 1329.0 | 0.223 |
| 1328.0 | 0.265 |
| 1327.0 | 0.297 |
| 1326.0 | 0.315 |
| 1325.0 | 0.316 |
| 1324.0 | 0.3 |
| 1323.0 | 0.27 |
| 1322.0 | 0.233 |
| 1321.0 | 0.196 |
| 1320.0 | 0.173 |
| 1319.0 | 0.17 |
| 1318.0 | 0.188 |
| 1317.0 | 0.224 |
| 1316.0 | 0.267 |
| 1315.0 | 0.307 |
| 1314.0 | 0.337 |
| 1313.0 | 0.351 |
| 1312.0 | 0.348 |
| 1311.0 | 0.33 |
| 1310.0 | 0.299 |
| 1309.0 | 0.26 |
| 1308.0 | 0.219 |
| 1307.0 | 0.186 |
| 1306.0 | 0.162 |
| 1305.0 | 0.151 |
| 1304.0 | 0.151 |
| 1303.0 | 0.156 |
| 1302.0 | 0.162 |
| 1301.0 | 0.163 |
| 1300.0 | 0.159 |
| 1299.0 | 0.149 |
| 1298.0 | 0.134 |
| 1297.0 | 0.118 |
| 1296.0 | 0.104 |
| 1295.0 | 0.092 |
| 1294.0 | 0.085 |
| 1293.0 | 0.082 |
| 1292.0 | 0.082 |
| 1291.0 | 0.083 |
| 1290.0 | 0.084 |
| 1289.0 | 0.086 |
| 1288.0 | 0.091 |
| 1287.0 | 0.1 |
| 1286.0 | 0.114 |
| 1285.0 | 0.133 |
| 1284.0 | 0.155 |
| 1283.0 | 0.176 |
| 1282.0 | 0.192 |
| 1281.0 | 0.201 |
| 1280.0 | 0.198 |
| 1279.0 | 0.186 |
| 1278.0 | 0.165 |
| 1277.0 | 0.14 |
| 1276.0 | 0.118 |
| 1275.0 | 0.105 |
| 1274.0 | 0.104 |
| 1273.0 | 0.116 |
| 1272.0 | 0.138 |
| 1271.0 | 0.163 |
| 1270.0 | 0.185 |
| 1269.0 | 0.2 |
| 1268.0 | 0.202 |
| 1267.0 | 0.194 |
| 1266.0 | 0.175 |
| 1265.0 | 0.151 |
| 1264.0 | 0.126 |
| 1263.0 | 0.104 |
| 1262.0 | 0.089 |
| 1261.0 | 0.083 |
| 1260.0 | 0.085 |
| 1259.0 | 0.091 |
| 1258.0 | 0.098 |
| 1257.0 | 0.103 |
| 1256.0 | 0.104 |
| 1255.0 | 0.102 |
| 1254.0 | 0.096 |
| 1253.0 | 0.089 |
| 1252.0 | 0.083 |
| 1251.0 | 0.078 |
| 1250.0 | 0.075 |
| 1249.0 | 0.073 |
| 1248.0 | 0.071 |
| 1247.0 | 0.07 |
| 1246.0 | 0.067 |
| 1245.0 | 0.064 |
| 1244.0 | 0.062 |
| 1243.0 | 0.061 |
| 1242.0 | 0.062 |
| 1241.0 | 0.067 |
| 1240.0 | 0.073 |
| 1239.0 | 0.079 |
| 1238.0 | 0.084 |
| 1237.0 | 0.086 |
| 1236.0 | 0.083 |
| 1235.0 | 0.077 |
| 1234.0 | 0.068 |
| 1233.0 | 0.06 |
| 1232.0 | 0.054 |
| 1231.0 | 0.052 |
| 1230.0 | 0.055 |
| 1229.0 | 0.061 |
| 1228.0 | 0.07 |
| 1227.0 | 0.078 |
| 1226.0 | 0.083 |
| 1225.0 | 0.083 |
| 1224.0 | 0.08 |
| 1223.0 | 0.073 |
| 1222.0 | 0.065 |
| 1221.0 | 0.058 |
| 1220.0 | 0.054 |
| 1219.0 | 0.054 |
| 1218.0 | 0.058 |
| 1217.0 | 0.064 |
| 1216.0 | 0.07 |
| 1215.0 | 0.074 |
| 1214.0 | 0.075 |
| 1213.0 | 0.072 |
| 1212.0 | 0.067 |
| 1211.0 | 0.061 |
| 1210.0 | 0.055 |
| 1209.0 | 0.053 |
| 1208.0 | 0.054 |
| 1207.0 | 0.058 |
| 1206.0 | 0.064 |
| 1205.0 | 0.068 |
| 1204.0 | 0.07 |
| 1203.0 | 0.069 |
| 1202.0 | 0.064 |
| 1201.0 | 0.058 |
| 1200.0 | 0.051 |
| 1199.0 | 0.048 |
| 1198.0 | 0.048 |
| 1197.0 | 0.051 |
| 1196.0 | 0.055 |
| 1195.0 | 0.058 |
| 1194.0 | 0.058 |
| 1193.0 | 0.055 |
| 1192.0 | 0.049 |
| 1191.0 | 0.043 |
| 1190.0 | 0.038 |
| 1189.0 | 0.037 |
| 1188.0 | 0.04 |
| 1187.0 | 0.044 |
| 1186.0 | 0.049 |
| 1185.0 | 0.05 |
| 1184.0 | 0.048 |
| 1183.0 | 0.043 |
| 1182.0 | 0.036 |
| 1181.0 | 0.031 |
| 1180.0 | 0.029 |
| 1179.0 | 0.031 |
| 1178.0 | 0.036 |
| 1177.0 | 0.042 |
| 1176.0 | 0.047 |
| 1175.0 | 0.048 |
| 1174.0 | 0.045 |
| 1173.0 | 0.039 |
| 1172.0 | 0.032 |
| 1171.0 | 0.028 |
| 1170.0 | 0.026 |
| 1169.0 | 0.029 |
| 1168.0 | 0.033 |
| 1167.0 | 0.038 |
| 1166.0 | 0.04 |
| 1165.0 | 0.039 |
| 1164.0 | 0.035 |
| 1163.0 | 0.029 |
| 1162.0 | 0.024 |
| 1161.0 | 0.022 |
| 1160.0 | 0.023 |
| 1159.0 | 0.025 |
| 1158.0 | 0.028 |
| 1157.0 | 0.028 |
| 1156.0 | 0.027 |
| 1155.0 | 0.025 |
| 1154.0 | 0.023 |
| 1153.0 | 0.024 |
| 1152.0 | 0.028 |
| 1151.0 | 0.033 |
| 1150.0 | 0.037 |
| 1149.0 | 0.038 |
| 1148.0 | 0.034 |
| 1147.0 | 0.028 |
| 1146.0 | 0.021 |
| 1145.0 | 0.017 |
| 1144.0 | 0.017 |
| 1143.0 | 0.022 |
| 1142.0 | 0.029 |
| 1141.0 | 0.035 |
| 1140.0 | 0.036 |
| 1139.0 | 0.033 |
| 1138.0 | 0.027 |
| 1137.0 | 0.019 |
| 1136.0 | 0.015 |
| 1135.0 | 0.015 |
| 1134.0 | 0.02 |
| 1133.0 | 0.027 |
| 1132.0 | 0.034 |
| 1131.0 | 0.035 |
| 1130.0 | 0.032 |
| 1129.0 | 0.025 |
| 1128.0 | 0.017 |
| 1127.0 | 0.013 |
| 1126.0 | 0.013 |
| 1125.0 | 0.018 |
| 1124.0 | 0.025 |
| 1123.0 | 0.029 |
| 1122.0 | 0.03 |
| 1121.0 | 0.025 |
| 1120.0 | 0.018 |
| 1119.0 | 0.012 |
| 1118.0 | 0.011 |
| 1117.0 | 0.017 |
| 1116.0 | 0.026 |
| 1115.0 | 0.036 |
| 1114.0 | 0.041 |
| 1113.0 | 0.04 |
| 1112.0 | 0.033 |
| 1111.0 | 0.023 |
| 1110.0 | 0.014 |
| 1109.0 | 0.009 |
| 1108.0 | 0.01 |
| 1107.0 | 0.015 |
| 1106.0 | 0.021 |
| 1105.0 | 0.025 |
| 1104.0 | 0.025 |
| 1103.0 | 0.022 |
| 1102.0 | 0.017 |
| 1101.0 | 0.012 |
| 1100.0 | 0.009 |
| 1099.0 | 0.008 |
| 1098.0 | 0.009 |
| 1097.0 | 0.009 |
| 1096.0 | 0.009 |
| 1095.0 | 0.008 |
| 1094.0 | 0.007 |
| 1093.0 | 0.005 |
| 1092.0 | 0.004 |
| 1091.0 | 0.004 |
| 1090.0 | 0.004 |
| 1089.0 | 0.005 |
| 1088.0 | 0.005 |
| 1087.0 | 0.005 |
| 1086.0 | 0.004 |
| 1085.0 | 0.004 |
| 1084.0 | 0.003 |
| 1083.0 | 0.003 |
| 1082.0 | 0.003 |
| 1081.0 | 0.003 |
| 1080.0 | 0.003 |
| 1079.0 | 0.002 |
| 1078.0 | 0.002 |
| 1077.0 | 0.002 |
| 1076.0 | 0.002 |
| 1075.0 | 0.002 |
| 1074.0 | 0.002 |
| 1073.0 | 0.002 |
| 1072.0 | 0.002 |
| 1071.0 | 0.002 |
| 1070.0 | 0.003 |
| 1069.0 | 0.003 |
| 1068.0 | 0.002 |
| 1067.0 | 0.002 |
| 1066.0 | 0.002 |
| 1065.0 | 0.001 |
| 1064.0 | 0.001 |
| 1063.0 | 0.001 |
| 1062.0 | 0.001 |
| 1061.0 | 0.001 |
| 1060.0 | 0.005 |
| 1059.0 | 0.005 |
| 1058.0 | 0.005 |
| 1057.0 | 0.009 |
| 1056.0 | 0.009 |
| 1055.0 | 0.006 |
| 1054.0 | 0.005 |
| 1053.0 | 0.008 |
| 1052.0 | 0.006 |
| 1051.0 | 0.007 |
| 1050.0 | 0.007 |
| 1049.0 | 0.005 |
| 1048.0 | 0.009 |
| 1047.0 | 0.009 |
| 1046.0 | 0.006 |
| 1045.0 | 0.006 |
| 1044.0 | 0.007 |
| 1043.0 | 0.003 |
| 1042.0 | 0.005 |
| 1041.0 | 0.005 |
| 1040.0 | 0.001 |
| 1039.0 | 0.002 |
| 1038.0 | 0.005 |
| 1037.0 | 0.004 |
| 1036.0 | 0.006 |
| 1035.0 | 0.005 |
| 1034.0 | 0.005 |
| 1033.0 | 0.005 |
| 1032.0 | 0.009 |
| 1031.0 | 0.009 |
| 1030.0 | 0.006 |
| 1029.0 | 0.005 |
| 1028.0 | 0.008 |
| 1027.0 | 0.006 |
| 1026.0 | 0.007 |
| 1025.0 | 0.007 |
| 1024.0 | 0.005 |
| 1023.0 | 0.007 |
| 1022.0 | 0.007 |
| 1021.0 | 0.006 |
| 1020.0 | 0.006 |
| 1019.0 | 0.008 |
| 1018.0 | 0.003 |
| 1017.0 | 0.005 |
| 1016.0 | 0.006 |
| 1015.0 | 0.001 |
| 1014.0 | 0.002 |
| 1013.0 | 0.006 |
| 1012.0 | 0.004 |
| 1011.0 | 0.007 |
| 1010.0 | 0.005 |
| 1009.0 | 0.005 |
| 1008.0 | 0.005 |
| 1007.0 | 0.009 |
| 1006.0 | 0.003 |
| 1005.0 | 0.006 |
| 1004.0 | 0.005 |
| 1003.0 | 0.008 |
| 1002.0 | 0.006 |
| 1001.0 | 0.007 |
| 1000.0 | 0.007 |
| 999.0 | 0.005 |
| 998.0 | 0.009 |
| 997.0 | 0.009 |
| 996.0 | 0.006 |
| 995.0 | 0.007 |
| 994.0 | 0.008 |
| 993.0 | 0.004 |
| 992.0 | 0.006 |
| 991.0 | 0.006 |
| 990.0 | 0.003 |
| 989.0 | 0.004 |
| 988.0 | 0.006 |
| 987.0 | 0.005 |
| 986.0 | 0.007 |
| 985.0 | 0.006 |
| 984.0 | 0.006 |
| 983.0 | 0.006 |
| 982.0 | 0.01 |
| 981.0 | 0.009 |
| 980.0 | 0.006 |
| 979.0 | 0.005 |
| 978.0 | 0.008 |
| 977.0 | 0.006 |
| 976.0 | 0.007 |
| 975.0 | 0.007 |
| 974.0 | 0.005 |
| 973.0 | 0.007 |
| 972.0 | 0.007 |
| 971.0 | 0.006 |
| 970.0 | 0.006 |
| 969.0 | 0.008 |
| 968.0 | 0.003 |
| 967.0 | 0.005 |
| 966.0 | 0.006 |
| 965.0 | 0.002 |
| 964.0 | 0.004 |
| 963.0 | 0.007 |
| 962.0 | 0.005 |
| 961.0 | 0.008 |
| 960.0 | 0.006 |
| 959.0 | 0.004 |
| 958.0 | 0.004 |
| 957.0 | 0.009 |
| 956.0 | 0.01 |
| 955.0 | 0.006 |
| 954.0 | 0.005 |
| 953.0 | 0.008 |
| 952.0 | 0.007 |
| 951.0 | 0.007 |
| 950.0 | 0.007 |
| 949.0 | 0.006 |
| 948.0 | 0.01 |
| 947.0 | 0.009 |
| 946.0 | 0.006 |
| 945.0 | 0.006 |
| 944.0 | 0.008 |
| 943.0 | 0.003 |
| 942.0 | 0.004 |
| 941.0 | 0.005 |
| 940.0 | 0.001 |
| 939.0 | 0.001 |
| 938.0 | 0.005 |
| 937.0 | 0.004 |
| 936.0 | 0.007 |
| 935.0 | 0.004 |
| 934.0 | 0.005 |
| 933.0 | 0.005 |
| 932.0 | 0.01 |
| 931.0 | 0.009 |
| 930.0 | 0.006 |
| 929.0 | 0.006 |
| 928.0 | 0.009 |
| 927.0 | 0.006 |
| 926.0 | 0.007 |
| 925.0 | 0.008 |
| 924.0 | 0.006 |
| 923.0 | 0.006 |
| 922.0 | 0.006 |
| 921.0 | 0.006 |
| 920.0 | 0.007 |
| 919.0 | 0.007 |
| 918.0 | 0.003 |
| 917.0 | 0.005 |
| 916.0 | 0.006 |
| 915.0 | 0.001 |
| 914.0 | 0.002 |
| 913.0 | 0.006 |
| 912.0 | 0.005 |
| 911.0 | 0.006 |
| 910.0 | 0.004 |
| 909.0 | 0.005 |
| 908.0 | 0.006 |
| 907.0 | 0.008 |
| 906.0 | 0.003 |
| 905.0 | 0.006 |
| 904.0 | 0.006 |
| 903.0 | 0.007 |
| 902.0 | 0.006 |
| 901.0 | 0.007 |
| 900.0 | 0.008 |
| 899.0 | 0.005 |
| 898.0 | 0.009 |
| 897.0 | 0.009 |
| 896.0 | 0.007 |
| 895.0 | 0.007 |
| 894.0 | 0.008 |
| 893.0 | 0.005 |
| 892.0 | 0.007 |
| 891.0 | 0.006 |
| 890.0 | 0.003 |
| 889.0 | 0.004 |
| 888.0 | 0.007 |
| 887.0 | 0.005 |
| 886.0 | 0.007 |
| 885.0 | 0.006 |
| 884.0 | 0.007 |
| 883.0 | 0.006 |
| 882.0 | 0.01 |
| 881.0 | 0.009 |
| 880.0 | 0.007 |
| 879.0 | 0.005 |
| 878.0 | 0.007 |
| 877.0 | 0.006 |
| 876.0 | 0.008 |
| 875.0 | 0.007 |
| 874.0 | 0.005 |
| 873.0 | 0.007 |
| 872.0 | 0.007 |
| 871.0 | 0.005 |
| 870.0 | 0.006 |
| 869.0 | 0.008 |
| 868.0 | 0.004 |
| 867.0 | 0.005 |
| 866.0 | 0.005 |
| 865.0 | 0.003 |
| 864.0 | 0.004 |
| 863.0 | 0.007 |
| 862.0 | 0.005 |
| 861.0 | 0.008 |
| 860.0 | 0.006 |
| 859.0 | 0.005 |
| 858.0 | 0.007 |
| 857.0 | 0.006 |
| 856.0 | 0.006 |
| 855.0 | 0.005 |
| 854.0 | 0.008 |
| 853.0 | 0.006 |
| 852.0 | 0.006 |
| 851.0 | 0.006 |
| 850.0 | 0.005 |
| 849.0 | 0.005 |
| 848.0 | 0.005 |
| 847.0 | 0.009 |
| 846.0 | 0.009 |
| 845.0 | 0.006 |
| 844.0 | 0.005 |
| 843.0 | 0.008 |
| 842.0 | 0.006 |
| 841.0 | 0.007 |
| 840.0 | 0.007 |
| 839.0 | 0.005 |
| 838.0 | 0.009 |
| 837.0 | 0.009 |
| 836.0 | 0.006 |
| 835.0 | 0.006 |
| 834.0 | 0.007 |
| 833.0 | 0.003 |
| 832.0 | 0.005 |
| 831.0 | 0.005 |
| 830.0 | 0.001 |
| 829.0 | 0.002 |
| 828.0 | 0.005 |
| 827.0 | 0.004 |
| 826.0 | 0.006 |
| 825.0 | 0.044 |
| 824.0 | 0.218 |
| 823.0 | 0.668 |
| 822.0 | 1.522 |
| 821.0 | 2.705 |
| 820.0 | 3.526 |
| 819.0 | 4.132 |
| 818.0 | 4.832 |
| 817.0 | 6.071 |
| 816.0 | 5.866 |
| 815.0 | 5.529 |
| 814.0 | 5.475 |
| 813.0 | 5.469 |
| 812.0 | 5.585 |
| 811.0 | 5.597 |
| 810.0 | 6.046 |
| 809.0 | 6.161 |
| 808.0 | 6.387 |
| 807.0 | 6.18 |
| 806.0 | 5.917 |
| 805.0 | 5.539 |
| 804.0 | 5.548 |
| 803.0 | 5.607 |
| 802.0 | 5.567 |
| 801.0 | 5.491 |
| 800.0 | 5.232 |
| 799.0 | 4.561 |
| 798.0 | 3.817 |
| 797.0 | 2.987 |
| 796.0 | 1.701 |
| 795.0 | 0.623 |
| 794.0 | 0.257 |
| 793.0 | 0.059 |
| 792.0 | 0.008 |
| 791.0 | 0.007 |
| 790.0 | 0.006 |
| 789.0 | 0.003 |
| 788.0 | 0.006 |
| 787.0 | 0.006 |
| 786.0 | 0.002 |
| 785.0 | 0.006 |
| 784.0 | 0.004 |
| 783.0 | 0.002 |
| 782.0 | 0.008 |
| 781.0 | 0.008 |
| 780.0 | 0.004 |
| 779.0 | 0.005 |
| 778.0 | 0.005 |
| 777.0 | 0.005 |
| 776.0 | 0.009 |
| 775.0 | 0.009 |
| 774.0 | 0.006 |
| 773.0 | 0.005 |
| 772.0 | 0.008 |
| 771.0 | 0.006 |
| 770.0 | 0.007 |
| 769.0 | 0.007 |
| 768.0 | 0.005 |
| 767.0 | 0.009 |
| 766.0 | 0.009 |
| 765.0 | 0.006 |
| 764.0 | 0.006 |
| 763.0 | 0.007 |
| 762.0 | 0.003 |
| 761.0 | 0.005 |
| 760.0 | 0.005 |
| 759.0 | 0.001 |
| 758.0 | 0.002 |
| 757.0 | 0.005 |
| 756.0 | 0.004 |
| 755.0 | 0.006 |
| 754.0 | 0.005 |
| 753.0 | 0.005 |
| 752.0 | 0.005 |
| 751.0 | 0.009 |
| 750.0 | 0.009 |
| 749.0 | 0.006 |
| 748.0 | 0.005 |
| 747.0 | 0.008 |
| 746.0 | 0.006 |
| 745.0 | 0.007 |
| 744.0 | 0.007 |
| 743.0 | 0.005 |
| 742.0 | 0.007 |
| 741.0 | 0.007 |
| 740.0 | 0.006 |
| 739.0 | 0.006 |
| 738.0 | 0.008 |
| 737.0 | 0.003 |
| 736.0 | 0.005 |
| 735.0 | 0.006 |
| 734.0 | 0.001 |
| 733.0 | 0.002 |
| 732.0 | 0.005 |
| 731.0 | 0.003 |
| 730.0 | 0.006 |
| 729.0 | 0.004 |
| 728.0 | 0.004 |
| 727.0 | 0.004 |
| 726.0 | 0.008 |
| 725.0 | 0.003 |
| 724.0 | 0.006 |
| 723.0 | 0.005 |
| 722.0 | 0.008 |
| 721.0 | 0.006 |
| 720.0 | 0.007 |
| 719.0 | 0.007 |
| 718.0 | 0.005 |
| 717.0 | 0.009 |
| 716.0 | 0.009 |
| 715.0 | 0.006 |
| 714.0 | 0.007 |
| 713.0 | 0.008 |
| 712.0 | 0.004 |
| 711.0 | 0.006 |
| 710.0 | 0.006 |
| 709.0 | 0.003 |
| 708.0 | 0.004 |
| 707.0 | 0.006 |
| 706.0 | 0.005 |
| 705.0 | 0.007 |
| 704.0 | 0.006 |
| 703.0 | 0.006 |
| 702.0 | 0.006 |
| 701.0 | 0.01 |
| 700.0 | 0.009 |
| 699.0 | 0.004 |
| 698.0 | 0.003 |
| 697.0 | 0.006 |
| 696.0 | 0.004 |
| 695.0 | 0.005 |
| 694.0 | 0.005 |
| 693.0 | 0.003 |
| 692.0 | 0.004 |
| 691.0 | 0.005 |
| 690.0 | 0.004 |
| 689.0 | 0.005 |
| 688.0 | 0.006 |
| 687.0 | 0.003 |
| 686.0 | 0.005 |
| 685.0 | 0.006 |
| 684.0 | 0.002 |
| 683.0 | 0.004 |
| 682.0 | 0.007 |
| 681.0 | 0.005 |
| 680.0 | 0.008 |
| 679.0 | 0.006 |
| 678.0 | 0.004 |
| 677.0 | 0.004 |
| 676.0 | 0.009 |
| 675.0 | 0.01 |
| 674.0 | 0.006 |
| 673.0 | 0.005 |
| 672.0 | 0.008 |
| 671.0 | 0.007 |
| 670.0 | 0.007 |
| 669.0 | 0.007 |
| 668.0 | 0.006 |
| 667.0 | 0.01 |
| 666.0 | 0.009 |
| 665.0 | 0.006 |
| 664.0 | 0.006 |
| 663.0 | 0.008 |
| 662.0 | 0.003 |
| 661.0 | 0.004 |
| 660.0 | 0.005 |
| 659.0 | 0.001 |
| 658.0 | 0.001 |
| 657.0 | 0.005 |
| 656.0 | 0.004 |
| 655.0 | 0.007 |
| 654.0 | 0.004 |
| 653.0 | 0.005 |
| 652.0 | 0.005 |
| 651.0 | 0.01 |
| 650.0 | 0.009 |
| 649.0 | 0.006 |
| 648.0 | 0.006 |
| 647.0 | 0.009 |
| 646.0 | 0.006 |
| 645.0 | 0.007 |
| 644.0 | 0.008 |
| 643.0 | 0.006 |
| 642.0 | 0.006 |
| 641.0 | 0.006 |
| 640.0 | 0.006 |
| 639.0 | 0.007 |
| 638.0 | 0.007 |
| 637.0 | 0.003 |
| 636.0 | 0.005 |
| 635.0 | 0.006 |
| 634.0 | 0.001 |
| 633.0 | 0.002 |
| 632.0 | 0.006 |
| 631.0 | 0.005 |
| 630.0 | 0.006 |
| 629.0 | 0.004 |
| 628.0 | 0.007 |
| 627.0 | 0.005 |
| 626.0 | 0.009 |
| 625.0 | 0.009 |
| 624.0 | 0.006 |
| 623.0 | 0.007 |
| 622.0 | 0.008 |
| 621.0 | 0.004 |
| 620.0 | 0.006 |
| 619.0 | 0.006 |
| 618.0 | 0.004 |
| 617.0 | 0.007 |
| 616.0 | 0.005 |
| 615.0 | 0.009 |
| 614.0 | 0.009 |
| 613.0 | 0.005 |
| 612.0 | 0.007 |
| 611.0 | 0.008 |
| 610.0 | 0.003 |
| 609.0 | 0.007 |
| 608.0 | 0.007 |
| 607.0 | 0.007 |
| 606.0 | 0.007 |
| 605.0 | 0.008 |
| 604.0 | 0.009 |
| 603.0 | 0.009 |
| 602.0 | 0.009 |
| 601.0 | 0.009 |
| 600.0 | 0.009 |
| 599.0 | 0.009 |
| 598.0 | 0.012 |
| 597.0 | 0.024 |
| 596.0 | 0.053 |
| 595.0 | 0.075 |
| 594.0 | 0.081 |
| 593.0 | 0.096 |
| 592.0 | 0.13 |
| 591.0 | 0.151 |
| 590.0 | 0.158 |
| 589.0 | 0.195 |
| 588.0 | 0.245 |
| 587.0 | 0.292 |
| 586.0 | 0.317 |
| 585.0 | 0.312 |
| 584.0 | 0.317 |
| 583.0 | 0.326 |
| 582.0 | 0.337 |
| 581.0 | 0.341 |
| 580.0 | 0.342 |
| 579.0 | 0.386 |
| 578.0 | 0.463 |
| 577.0 | 0.527 |
| 576.0 | 0.595 |
| 575.0 | 0.659 |
| 574.0 | 0.707 |
| 573.0 | 0.779 |
| 572.0 | 0.81 |
| 571.0 | 0.784 |
| 570.0 | 0.79 |
| 569.0 | 0.858 |
| 568.0 | 0.984 |
| 567.0 | 1.113 |
| 566.0 | 1.162 |
| 565.0 | 1.181 |
| 564.0 | 1.248 |
| 563.0 | 1.339 |
| 562.0 | 1.443 |
| 561.0 | 1.565 |
| 560.0 | 1.597 |
| 559.0 | 1.655 |
| 558.0 | 1.875 |
| 557.0 | 2.165 |
| 556.0 | 2.378 |
| 555.0 | 2.626 |
| 554.0 | 2.944 |
| 553.0 | 3.352 |
| 552.0 | 3.818 |
| 551.0 | 4.686 |
| 550.0 | 4.664 |
| 549.0 | 4.292 |
| 548.0 | 4.216 |
| 547.0 | 4.224 |
| 546.0 | 4.362 |
| 545.0 | 4.248 |
| 544.0 | 4.584 |
| 543.0 | 4.396 |
| 542.0 | 4.208 |
| 541.0 | 4.186 |
| 540.0 | 4.2 |
| 539.0 | 4.274 |
| 538.0 | 4.621 |
| 537.0 | 4.445 |
| 536.0 | 4.231 |
| 535.0 | 4.185 |
| 534.0 | 4.207 |
| 533.0 | 4.35 |
| 532.0 | 4.445 |
| 531.0 | 4.215 |
| 530.0 | 4.215 |
| 529.0 | 4.3 |
| 528.0 | 4.407 |
| 527.0 | 4.282 |
| 526.0 | 4.565 |
| 525.0 | 4.395 |
| 524.0 | 4.177 |
| 523.0 | 4.214 |
| 522.0 | 4.214 |
| 521.0 | 4.309 |
| 520.0 | 4.515 |
| 519.0 | 4.382 |
| 518.0 | 4.17 |
| 517.0 | 4.281 |
| 516.0 | 4.318 |
| 515.0 | 4.246 |
| 514.0 | 4.53 |
| 513.0 | 4.43 |
| 512.0 | 4.198 |
| 511.0 | 4.289 |
| 510.0 | 4.299 |
| 509.0 | 4.318 |
| 508.0 | 4.6 |
| 507.0 | 4.443 |
| 506.0 | 4.213 |
| 505.0 | 4.308 |
| 504.0 | 4.308 |
| 503.0 | 4.298 |
| 502.0 | 4.581 |
| 501.0 | 4.47 |
| 500.0 | 4.213 |
| 499.0 | 4.253 |
| 498.0 | 4.261 |
| 497.0 | 4.279 |
| 496.0 | 4.513 |
| 495.0 | 4.358 |
| 494.0 | 4.197 |
| 493.0 | 4.228 |
| 492.0 | 4.182 |
| 491.0 | 4.358 |
| 490.0 | 4.598 |
| 489.0 | 4.392 |
| 488.0 | 4.212 |
| 487.0 | 4.316 |
| 486.0 | 4.326 |
| 485.0 | 4.326 |
| 484.0 | 4.545 |
| 483.0 | 4.326 |
| 482.0 | 4.189 |
| 481.0 | 4.252 |
| 480.0 | 4.243 |
| 479.0 | 4.296 |
| 478.0 | 4.496 |
| 477.0 | 4.336 |
| 476.0 | 4.203 |
| 475.0 | 4.268 |
| 474.0 | 4.286 |
| 473.0 | 4.356 |
| 472.0 | 4.527 |
| 471.0 | 4.315 |
| 470.0 | 4.18 |
| 469.0 | 4.258 |
| 468.0 | 4.241 |
| 467.0 | 4.304 |
| 466.0 | 4.542 |
| 465.0 | 4.304 |
| 464.0 | 4.172 |
| 463.0 | 4.186 |
| 462.0 | 4.201 |
| 461.0 | 4.388 |
| 460.0 | 4.576 |
| 459.0 | 4.365 |
| 458.0 | 4.275 |
| 457.0 | 4.257 |
| 456.0 | 4.156 |
| 455.0 | 4.303 |
| 454.0 | 4.633 |
| 453.0 | 4.387 |
| 452.0 | 4.248 |
| 451.0 | 4.191 |
| 450.0 | 4.184 |
| 449.0 | 4.411 |
| 448.0 | 4.654 |
| 447.0 | 4.423 |
| 446.0 | 4.238 |
| 445.0 | 4.141 |
| 444.0 | 4.19 |
| 443.0 | 4.491 |
| 442.0 | 4.698 |
| 441.0 | 4.409 |
| 440.0 | 4.246 |
| 439.0 | 4.245 |
| 438.0 | 4.263 |
| 437.0 | 4.362 |
| 436.0 | 4.476 |
| 435.0 | 4.271 |
| 434.0 | 4.174 |
| 433.0 | 4.329 |
| 432.0 | 4.299 |
| 431.0 | 4.328 |
| 430.0 | 4.537 |
| 429.0 | 4.339 |
| 428.0 | 4.235 |
| 427.0 | 4.338 |
| 426.0 | 4.328 |
| 425.0 | 4.394 |
| 424.0 | 4.608 |
| 423.0 | 4.288 |
| 422.0 | 4.218 |
| 421.0 | 4.473 |
| 420.0 | 4.348 |
| 419.0 | 4.431 |
| 418.0 | 4.908 |
| 417.0 | 4.259 |
| 416.0 | 4.104 |
| 415.0 | 4.233 |
| 414.0 | 4.325 |
| 413.0 | 4.357 |
| 412.0 | 4.693 |
| 411.0 | 4.315 |
| 410.0 | 4.17 |
| 409.0 | 4.169 |
| 408.0 | 4.24 |
| 407.0 | 4.314 |
| 406.0 | 4.549 |
| 405.0 | 4.345 |
| 404.0 | 4.284 |
| 403.0 | 4.355 |
| 402.0 | 4.265 |
| 401.0 | 4.415 |
| 400.0 | 5.043 |
| 399.0 | 4.946 |
| 398.0 | 4.366 |
| 397.0 | 3.545 |
| 396.0 | 3.294 |
| 395.0 | 2.888 |
| 394.0 | 2.254 |
| 393.0 | 1.802 |
| 392.0 | 1.639 |
| 391.0 | 1.767 |
| 390.0 | 2.044 |
| 389.0 | 2.144 |
| 388.0 | 2.259 |
| 387.0 | 2.561 |
| 386.0 | 2.77 |
| 385.0 | 2.786 |
| 384.0 | 2.966 |
| 383.0 | 2.751 |
| 382.0 | 2.281 |
| 381.0 | 2.093 |
| 380.0 | 1.909 |
| 379.0 | 1.763 |
| 378.0 | 1.872 |
| 377.0 | 2.176 |
| 376.0 | 2.366 |
| 375.0 | 2.338 |
| 374.0 | 2.04 |
| 373.0 | 1.623 |
| 372.0 | 1.358 |
| 371.0 | 1.256 |
| 370.0 | 1.309 |
| 369.0 | 1.525 |
| 368.0 | 1.881 |
| 367.0 | 2.219 |
| 366.0 | 2.387 |
| 365.0 | 2.308 |
| 364.0 | 2.177 |
| 363.0 | 2.213 |
| 362.0 | 2.468 |
| 361.0 | 2.885 |
| 360.0 | 3.204 |
| 359.0 | 3.375 |
| 358.0 | 3.812 |
| 357.0 | 5.936 |
| 356.0 | 4.245 |
| 355.0 | 4.613 |
| 354.0 | 4.656 |
| 353.0 | 4.367 |
| 352.0 | 4.253 |
| 351.0 | 4.227 |
| 350.0 | 4.178 |
| 349.0 | 4.758 |
| 348.0 | 4.892 |
| 347.0 | 4.252 |
| 346.0 | 4.155 |
| 345.0 | 4.365 |
| 344.0 | 4.234 |
| 343.0 | 4.933 |
| 342.0 | 4.702 |
| 341.0 | 4.364 |
| 340.0 | 4.147 |
| 339.0 | 4.224 |
| 338.0 | 4.233 |
| 337.0 | 4.63 |
| 336.0 | 4.755 |
| 335.0 | 4.25 |
| 334.0 | 4.19 |
| 333.0 | 4.24 |
| 332.0 | 4.19 |
| 331.0 | 4.726 |
| 330.0 | 4.55 |
| 329.0 | 4.276 |
| 328.0 | 4.181 |
| 327.0 | 4.197 |
| 326.0 | 4.276 |
| 325.0 | 4.699 |
| 324.0 | 4.928 |
| 323.0 | 4.204 |
| 322.0 | 4.204 |
| 321.0 | 4.164 |
| 320.0 | 4.238 |
| 319.0 | 4.605 |
| 318.0 | 4.272 |
| 317.0 | 4.272 |
| 316.0 | 4.356 |
| 315.0 | 4.694 |
| 314.0 | 4.271 |
| 313.0 | 4.882 |
| 312.0 | 4.747 |
| 311.0 | 4.344 |
| 310.0 | 4.251 |
| 309.0 | 4.508 |
| 308.0 | 4.19 |
| 307.0 | 4.881 |
| 306.0 | 4.309 |
| 305.0 | 4.331 |
| 304.0 | 4.258 |
| 303.0 | 4.745 |
| 302.0 | 4.24 |
| 301.0 | 5.075 |
| 300.0 | 4.665 |
| 299.0 | 4.388 |
| 298.0 | 4.171 |
| 297.0 | 4.557 |
| 296.0 | 4.22 |
| 295.0 | 4.84 |
| 294.0 | 4.84 |
| 293.0 | 4.35 |
| 292.0 | 4.147 |
| 291.0 | 4.771 |
| 290.0 | 4.245 |
| 289.0 | 5.014 |
| 288.0 | 4.616 |
| 287.0 | 4.315 |
| 286.0 | 4.184 |
| 285.0 | 5.013 |
| 284.0 | 4.303 |
| 283.0 | 4.769 |
| 282.0 | 4.66 |
| 281.0 | 4.396 |
| 280.0 | 4.224 |
| 279.0 | 4.233 |
| 278.0 | 4.207 |
| 277.0 | 4.409 |
| 276.0 | 4.37 |
| 275.0 | 4.27 |
| 274.0 | 4.142 |
| 273.0 | 4.241 |
| 272.0 | 4.29 |
| 271.0 | 4.289 |
| 270.0 | 4.279 |
| 269.0 | 4.25 |
| 268.0 | 4.59 |
| 267.0 | 4.833 |
| 266.0 | 5.067 |
| 265.0 | 4.833 |
| 264.0 | 5.134 |
| 263.0 | 4.912 |
| 262.0 | 4.179 |
| 261.0 | 4.163 |
| 260.0 | 4.735 |
| 259.0 | 4.133 |
| 258.0 | 5.066 |
| 257.0 | 4.433 |
| 256.0 | 4.378 |
| 255.0 | 4.11 |
| 254.0 | 4.83 |
| 253.0 | 4.131 |
| 252.0 | 5.005 |
| 251.0 | 4.629 |
| 250.0 | 4.183 |
| 249.0 | 4.151 |
| 248.0 | 4.628 |
| 247.0 | 4.166 |
| 246.0 | 5.606 |
| 245.0 | 4.491 |
| 244.0 | 4.337 |
| 243.0 | 4.142 |
| 242.0 | 4.262 |
| 241.0 | 4.234 |
| 240.0 | 4.906 |
| 239.0 | 4.387 |
| 238.0 | 4.173 |
| 237.0 | 4.086 |
| 236.0 | 4.675 |
| 235.0 | 4.173 |
| 234.0 | 4.864 |
| 233.0 | 4.507 |
| 232.0 | 4.181 |
| 231.0 | 4.172 |
| 230.0 | 4.292 |
| 229.0 | 4.188 |
| 228.0 | 4.699 |
| 227.0 | 4.504 |
| 226.0 | 4.185 |
| 225.0 | 4.153 |
| 224.0 | 4.137 |
| 223.0 | 4.151 |
| 222.0 | 4.556 |
| 221.0 | 4.693 |
| 220.0 | 4.111 |
| 219.0 | 4.197 |
| 218.0 | 4.293 |
| 217.0 | 4.178 |
| 216.0 | 4.513 |
| 215.0 | 4.531 |
| 214.0 | 4.072 |
| 213.0 | 4.175 |
| 212.0 | 4.346 |
| 211.0 | 4.208 |
| 210.0 | 4.457 |
| 209.0 | 4.742 |
| 208.0 | 4.08 |
| 207.0 | 4.073 |
| 206.0 | 4.232 |
| 205.0 | 4.185 |
| 204.0 | 4.293 |
| 203.0 | 4.27 |
| 202.0 | 3.952 |
| 201.0 | 4.006 |
| 200.0 | 3.983 |